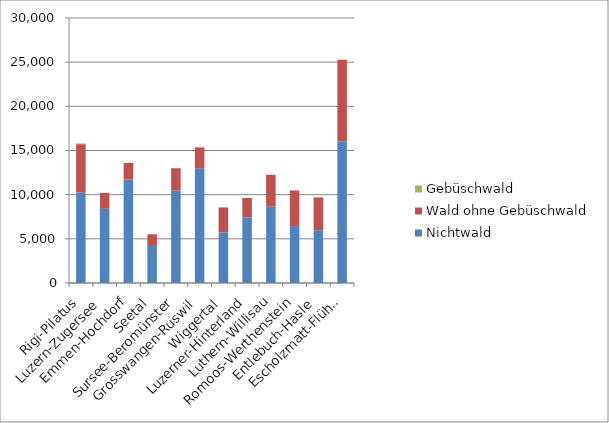
| Category | Nichtwald | Wald ohne Gebüschwald | Gebüschwald |
|---|---|---|---|
| Rigi-Pilatus | 10224.7 | 5490.1 | 75.6 |
| Luzern-Zugersee | 8398 | 1803.1 | 0 |
| Emmen-Hochdorf | 11699.1 | 1882.9 | 0 |
| Seetal | 4197.1 | 1316.3 | 0 |
| Sursee-Beromünster | 10460.6 | 2533.6 | 0 |
| Grosswangen-Ruswil | 12982.5 | 2369.4 | 0 |
| Wiggertal | 5729.1 | 2826.7 | 0 |
| Luzerner-Hinterland | 7433.1 | 2187.7 | 0 |
| Luthern-Willisau | 8633.7 | 3614.1 | 0 |
| Romoos-Werthenstein | 6445.3 | 4031.4 | 0 |
| Entlebuch-Hasle | 5978.2 | 3692.4 | 50.2 |
| Escholzmatt-Flühli | 16039.5 | 9204.6 | 49.9 |